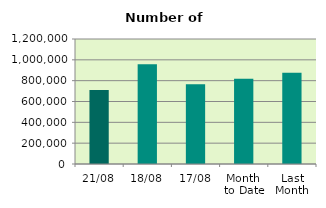
| Category | Series 0 |
|---|---|
| 21/08 | 709672 |
| 18/08 | 957270 |
| 17/08 | 765210 |
| Month 
to Date | 817605.733 |
| Last
Month | 877151.619 |